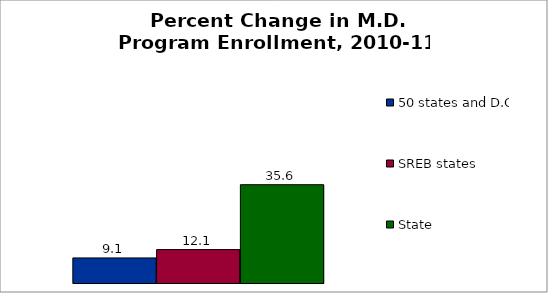
| Category | 50 states and D.C. | SREB states | State |
|---|---|---|---|
| 0 | 9.077 | 12.096 | 35.578 |